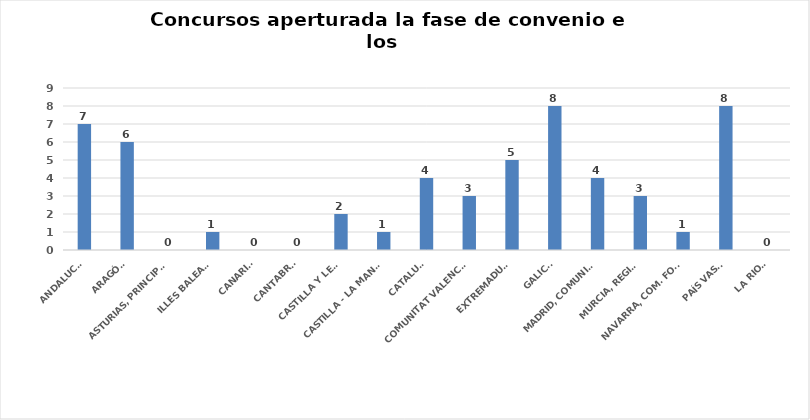
| Category | Series 0 |
|---|---|
| ANDALUCÍA | 7 |
| ARAGÓN | 6 |
| ASTURIAS, PRINCIPADO | 0 |
| ILLES BALEARS | 1 |
| CANARIAS | 0 |
| CANTABRIA | 0 |
| CASTILLA Y LEÓN | 2 |
| CASTILLA - LA MANCHA | 1 |
| CATALUÑA | 4 |
| COMUNITAT VALENCIANA | 3 |
| EXTREMADURA | 5 |
| GALICIA | 8 |
| MADRID, COMUNIDAD | 4 |
| MURCIA, REGIÓN | 3 |
| NAVARRA, COM. FORAL | 1 |
| PAÍS VASCO | 8 |
| LA RIOJA | 0 |